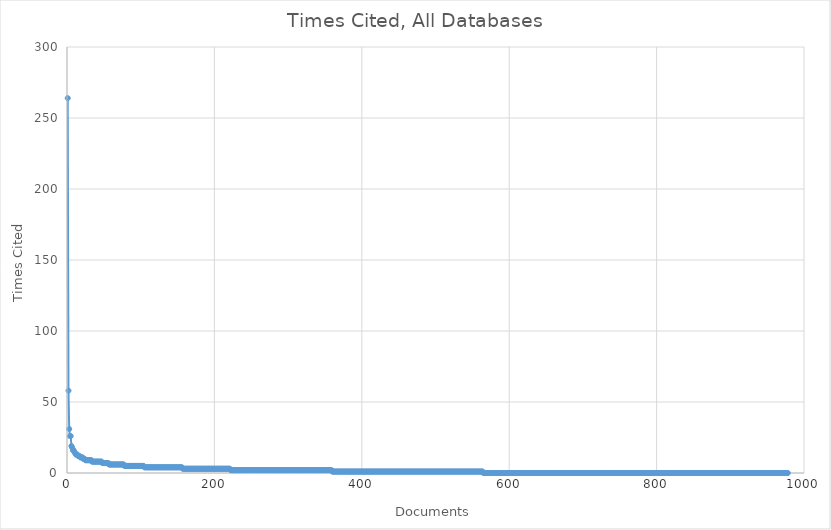
| Category | Times Cited, All Databases |
|---|---|
| 0 | 264 |
| 1 | 58 |
| 2 | 31 |
| 3 | 26 |
| 4 | 26 |
| 5 | 19 |
| 6 | 18 |
| 7 | 16 |
| 8 | 16 |
| 9 | 15 |
| 10 | 14 |
| 11 | 13 |
| 12 | 13 |
| 13 | 13 |
| 14 | 12 |
| 15 | 12 |
| 16 | 12 |
| 17 | 11 |
| 18 | 11 |
| 19 | 11 |
| 20 | 11 |
| 21 | 10 |
| 22 | 10 |
| 23 | 10 |
| 24 | 9 |
| 25 | 9 |
| 26 | 9 |
| 27 | 9 |
| 28 | 9 |
| 29 | 9 |
| 30 | 9 |
| 31 | 9 |
| 32 | 9 |
| 33 | 8 |
| 34 | 8 |
| 35 | 8 |
| 36 | 8 |
| 37 | 8 |
| 38 | 8 |
| 39 | 8 |
| 40 | 8 |
| 41 | 8 |
| 42 | 8 |
| 43 | 8 |
| 44 | 8 |
| 45 | 8 |
| 46 | 8 |
| 47 | 7 |
| 48 | 7 |
| 49 | 7 |
| 50 | 7 |
| 51 | 7 |
| 52 | 7 |
| 53 | 7 |
| 54 | 7 |
| 55 | 7 |
| 56 | 6 |
| 57 | 6 |
| 58 | 6 |
| 59 | 6 |
| 60 | 6 |
| 61 | 6 |
| 62 | 6 |
| 63 | 6 |
| 64 | 6 |
| 65 | 6 |
| 66 | 6 |
| 67 | 6 |
| 68 | 6 |
| 69 | 6 |
| 70 | 6 |
| 71 | 6 |
| 72 | 6 |
| 73 | 6 |
| 74 | 6 |
| 75 | 6 |
| 76 | 6 |
| 77 | 5 |
| 78 | 5 |
| 79 | 5 |
| 80 | 5 |
| 81 | 5 |
| 82 | 5 |
| 83 | 5 |
| 84 | 5 |
| 85 | 5 |
| 86 | 5 |
| 87 | 5 |
| 88 | 5 |
| 89 | 5 |
| 90 | 5 |
| 91 | 5 |
| 92 | 5 |
| 93 | 5 |
| 94 | 5 |
| 95 | 5 |
| 96 | 5 |
| 97 | 5 |
| 98 | 5 |
| 99 | 5 |
| 100 | 5 |
| 101 | 5 |
| 102 | 5 |
| 103 | 5 |
| 104 | 4 |
| 105 | 4 |
| 106 | 4 |
| 107 | 4 |
| 108 | 4 |
| 109 | 4 |
| 110 | 4 |
| 111 | 4 |
| 112 | 4 |
| 113 | 4 |
| 114 | 4 |
| 115 | 4 |
| 116 | 4 |
| 117 | 4 |
| 118 | 4 |
| 119 | 4 |
| 120 | 4 |
| 121 | 4 |
| 122 | 4 |
| 123 | 4 |
| 124 | 4 |
| 125 | 4 |
| 126 | 4 |
| 127 | 4 |
| 128 | 4 |
| 129 | 4 |
| 130 | 4 |
| 131 | 4 |
| 132 | 4 |
| 133 | 4 |
| 134 | 4 |
| 135 | 4 |
| 136 | 4 |
| 137 | 4 |
| 138 | 4 |
| 139 | 4 |
| 140 | 4 |
| 141 | 4 |
| 142 | 4 |
| 143 | 4 |
| 144 | 4 |
| 145 | 4 |
| 146 | 4 |
| 147 | 4 |
| 148 | 4 |
| 149 | 4 |
| 150 | 4 |
| 151 | 4 |
| 152 | 4 |
| 153 | 4 |
| 154 | 4 |
| 155 | 4 |
| 156 | 3 |
| 157 | 3 |
| 158 | 3 |
| 159 | 3 |
| 160 | 3 |
| 161 | 3 |
| 162 | 3 |
| 163 | 3 |
| 164 | 3 |
| 165 | 3 |
| 166 | 3 |
| 167 | 3 |
| 168 | 3 |
| 169 | 3 |
| 170 | 3 |
| 171 | 3 |
| 172 | 3 |
| 173 | 3 |
| 174 | 3 |
| 175 | 3 |
| 176 | 3 |
| 177 | 3 |
| 178 | 3 |
| 179 | 3 |
| 180 | 3 |
| 181 | 3 |
| 182 | 3 |
| 183 | 3 |
| 184 | 3 |
| 185 | 3 |
| 186 | 3 |
| 187 | 3 |
| 188 | 3 |
| 189 | 3 |
| 190 | 3 |
| 191 | 3 |
| 192 | 3 |
| 193 | 3 |
| 194 | 3 |
| 195 | 3 |
| 196 | 3 |
| 197 | 3 |
| 198 | 3 |
| 199 | 3 |
| 200 | 3 |
| 201 | 3 |
| 202 | 3 |
| 203 | 3 |
| 204 | 3 |
| 205 | 3 |
| 206 | 3 |
| 207 | 3 |
| 208 | 3 |
| 209 | 3 |
| 210 | 3 |
| 211 | 3 |
| 212 | 3 |
| 213 | 3 |
| 214 | 3 |
| 215 | 3 |
| 216 | 3 |
| 217 | 3 |
| 218 | 3 |
| 219 | 3 |
| 220 | 3 |
| 221 | 2 |
| 222 | 2 |
| 223 | 2 |
| 224 | 2 |
| 225 | 2 |
| 226 | 2 |
| 227 | 2 |
| 228 | 2 |
| 229 | 2 |
| 230 | 2 |
| 231 | 2 |
| 232 | 2 |
| 233 | 2 |
| 234 | 2 |
| 235 | 2 |
| 236 | 2 |
| 237 | 2 |
| 238 | 2 |
| 239 | 2 |
| 240 | 2 |
| 241 | 2 |
| 242 | 2 |
| 243 | 2 |
| 244 | 2 |
| 245 | 2 |
| 246 | 2 |
| 247 | 2 |
| 248 | 2 |
| 249 | 2 |
| 250 | 2 |
| 251 | 2 |
| 252 | 2 |
| 253 | 2 |
| 254 | 2 |
| 255 | 2 |
| 256 | 2 |
| 257 | 2 |
| 258 | 2 |
| 259 | 2 |
| 260 | 2 |
| 261 | 2 |
| 262 | 2 |
| 263 | 2 |
| 264 | 2 |
| 265 | 2 |
| 266 | 2 |
| 267 | 2 |
| 268 | 2 |
| 269 | 2 |
| 270 | 2 |
| 271 | 2 |
| 272 | 2 |
| 273 | 2 |
| 274 | 2 |
| 275 | 2 |
| 276 | 2 |
| 277 | 2 |
| 278 | 2 |
| 279 | 2 |
| 280 | 2 |
| 281 | 2 |
| 282 | 2 |
| 283 | 2 |
| 284 | 2 |
| 285 | 2 |
| 286 | 2 |
| 287 | 2 |
| 288 | 2 |
| 289 | 2 |
| 290 | 2 |
| 291 | 2 |
| 292 | 2 |
| 293 | 2 |
| 294 | 2 |
| 295 | 2 |
| 296 | 2 |
| 297 | 2 |
| 298 | 2 |
| 299 | 2 |
| 300 | 2 |
| 301 | 2 |
| 302 | 2 |
| 303 | 2 |
| 304 | 2 |
| 305 | 2 |
| 306 | 2 |
| 307 | 2 |
| 308 | 2 |
| 309 | 2 |
| 310 | 2 |
| 311 | 2 |
| 312 | 2 |
| 313 | 2 |
| 314 | 2 |
| 315 | 2 |
| 316 | 2 |
| 317 | 2 |
| 318 | 2 |
| 319 | 2 |
| 320 | 2 |
| 321 | 2 |
| 322 | 2 |
| 323 | 2 |
| 324 | 2 |
| 325 | 2 |
| 326 | 2 |
| 327 | 2 |
| 328 | 2 |
| 329 | 2 |
| 330 | 2 |
| 331 | 2 |
| 332 | 2 |
| 333 | 2 |
| 334 | 2 |
| 335 | 2 |
| 336 | 2 |
| 337 | 2 |
| 338 | 2 |
| 339 | 2 |
| 340 | 2 |
| 341 | 2 |
| 342 | 2 |
| 343 | 2 |
| 344 | 2 |
| 345 | 2 |
| 346 | 2 |
| 347 | 2 |
| 348 | 2 |
| 349 | 2 |
| 350 | 2 |
| 351 | 2 |
| 352 | 2 |
| 353 | 2 |
| 354 | 2 |
| 355 | 2 |
| 356 | 2 |
| 357 | 2 |
| 358 | 2 |
| 359 | 1 |
| 360 | 1 |
| 361 | 1 |
| 362 | 1 |
| 363 | 1 |
| 364 | 1 |
| 365 | 1 |
| 366 | 1 |
| 367 | 1 |
| 368 | 1 |
| 369 | 1 |
| 370 | 1 |
| 371 | 1 |
| 372 | 1 |
| 373 | 1 |
| 374 | 1 |
| 375 | 1 |
| 376 | 1 |
| 377 | 1 |
| 378 | 1 |
| 379 | 1 |
| 380 | 1 |
| 381 | 1 |
| 382 | 1 |
| 383 | 1 |
| 384 | 1 |
| 385 | 1 |
| 386 | 1 |
| 387 | 1 |
| 388 | 1 |
| 389 | 1 |
| 390 | 1 |
| 391 | 1 |
| 392 | 1 |
| 393 | 1 |
| 394 | 1 |
| 395 | 1 |
| 396 | 1 |
| 397 | 1 |
| 398 | 1 |
| 399 | 1 |
| 400 | 1 |
| 401 | 1 |
| 402 | 1 |
| 403 | 1 |
| 404 | 1 |
| 405 | 1 |
| 406 | 1 |
| 407 | 1 |
| 408 | 1 |
| 409 | 1 |
| 410 | 1 |
| 411 | 1 |
| 412 | 1 |
| 413 | 1 |
| 414 | 1 |
| 415 | 1 |
| 416 | 1 |
| 417 | 1 |
| 418 | 1 |
| 419 | 1 |
| 420 | 1 |
| 421 | 1 |
| 422 | 1 |
| 423 | 1 |
| 424 | 1 |
| 425 | 1 |
| 426 | 1 |
| 427 | 1 |
| 428 | 1 |
| 429 | 1 |
| 430 | 1 |
| 431 | 1 |
| 432 | 1 |
| 433 | 1 |
| 434 | 1 |
| 435 | 1 |
| 436 | 1 |
| 437 | 1 |
| 438 | 1 |
| 439 | 1 |
| 440 | 1 |
| 441 | 1 |
| 442 | 1 |
| 443 | 1 |
| 444 | 1 |
| 445 | 1 |
| 446 | 1 |
| 447 | 1 |
| 448 | 1 |
| 449 | 1 |
| 450 | 1 |
| 451 | 1 |
| 452 | 1 |
| 453 | 1 |
| 454 | 1 |
| 455 | 1 |
| 456 | 1 |
| 457 | 1 |
| 458 | 1 |
| 459 | 1 |
| 460 | 1 |
| 461 | 1 |
| 462 | 1 |
| 463 | 1 |
| 464 | 1 |
| 465 | 1 |
| 466 | 1 |
| 467 | 1 |
| 468 | 1 |
| 469 | 1 |
| 470 | 1 |
| 471 | 1 |
| 472 | 1 |
| 473 | 1 |
| 474 | 1 |
| 475 | 1 |
| 476 | 1 |
| 477 | 1 |
| 478 | 1 |
| 479 | 1 |
| 480 | 1 |
| 481 | 1 |
| 482 | 1 |
| 483 | 1 |
| 484 | 1 |
| 485 | 1 |
| 486 | 1 |
| 487 | 1 |
| 488 | 1 |
| 489 | 1 |
| 490 | 1 |
| 491 | 1 |
| 492 | 1 |
| 493 | 1 |
| 494 | 1 |
| 495 | 1 |
| 496 | 1 |
| 497 | 1 |
| 498 | 1 |
| 499 | 1 |
| 500 | 1 |
| 501 | 1 |
| 502 | 1 |
| 503 | 1 |
| 504 | 1 |
| 505 | 1 |
| 506 | 1 |
| 507 | 1 |
| 508 | 1 |
| 509 | 1 |
| 510 | 1 |
| 511 | 1 |
| 512 | 1 |
| 513 | 1 |
| 514 | 1 |
| 515 | 1 |
| 516 | 1 |
| 517 | 1 |
| 518 | 1 |
| 519 | 1 |
| 520 | 1 |
| 521 | 1 |
| 522 | 1 |
| 523 | 1 |
| 524 | 1 |
| 525 | 1 |
| 526 | 1 |
| 527 | 1 |
| 528 | 1 |
| 529 | 1 |
| 530 | 1 |
| 531 | 1 |
| 532 | 1 |
| 533 | 1 |
| 534 | 1 |
| 535 | 1 |
| 536 | 1 |
| 537 | 1 |
| 538 | 1 |
| 539 | 1 |
| 540 | 1 |
| 541 | 1 |
| 542 | 1 |
| 543 | 1 |
| 544 | 1 |
| 545 | 1 |
| 546 | 1 |
| 547 | 1 |
| 548 | 1 |
| 549 | 1 |
| 550 | 1 |
| 551 | 1 |
| 552 | 1 |
| 553 | 1 |
| 554 | 1 |
| 555 | 1 |
| 556 | 1 |
| 557 | 1 |
| 558 | 1 |
| 559 | 1 |
| 560 | 1 |
| 561 | 1 |
| 562 | 1 |
| 563 | 1 |
| 564 | 0 |
| 565 | 0 |
| 566 | 0 |
| 567 | 0 |
| 568 | 0 |
| 569 | 0 |
| 570 | 0 |
| 571 | 0 |
| 572 | 0 |
| 573 | 0 |
| 574 | 0 |
| 575 | 0 |
| 576 | 0 |
| 577 | 0 |
| 578 | 0 |
| 579 | 0 |
| 580 | 0 |
| 581 | 0 |
| 582 | 0 |
| 583 | 0 |
| 584 | 0 |
| 585 | 0 |
| 586 | 0 |
| 587 | 0 |
| 588 | 0 |
| 589 | 0 |
| 590 | 0 |
| 591 | 0 |
| 592 | 0 |
| 593 | 0 |
| 594 | 0 |
| 595 | 0 |
| 596 | 0 |
| 597 | 0 |
| 598 | 0 |
| 599 | 0 |
| 600 | 0 |
| 601 | 0 |
| 602 | 0 |
| 603 | 0 |
| 604 | 0 |
| 605 | 0 |
| 606 | 0 |
| 607 | 0 |
| 608 | 0 |
| 609 | 0 |
| 610 | 0 |
| 611 | 0 |
| 612 | 0 |
| 613 | 0 |
| 614 | 0 |
| 615 | 0 |
| 616 | 0 |
| 617 | 0 |
| 618 | 0 |
| 619 | 0 |
| 620 | 0 |
| 621 | 0 |
| 622 | 0 |
| 623 | 0 |
| 624 | 0 |
| 625 | 0 |
| 626 | 0 |
| 627 | 0 |
| 628 | 0 |
| 629 | 0 |
| 630 | 0 |
| 631 | 0 |
| 632 | 0 |
| 633 | 0 |
| 634 | 0 |
| 635 | 0 |
| 636 | 0 |
| 637 | 0 |
| 638 | 0 |
| 639 | 0 |
| 640 | 0 |
| 641 | 0 |
| 642 | 0 |
| 643 | 0 |
| 644 | 0 |
| 645 | 0 |
| 646 | 0 |
| 647 | 0 |
| 648 | 0 |
| 649 | 0 |
| 650 | 0 |
| 651 | 0 |
| 652 | 0 |
| 653 | 0 |
| 654 | 0 |
| 655 | 0 |
| 656 | 0 |
| 657 | 0 |
| 658 | 0 |
| 659 | 0 |
| 660 | 0 |
| 661 | 0 |
| 662 | 0 |
| 663 | 0 |
| 664 | 0 |
| 665 | 0 |
| 666 | 0 |
| 667 | 0 |
| 668 | 0 |
| 669 | 0 |
| 670 | 0 |
| 671 | 0 |
| 672 | 0 |
| 673 | 0 |
| 674 | 0 |
| 675 | 0 |
| 676 | 0 |
| 677 | 0 |
| 678 | 0 |
| 679 | 0 |
| 680 | 0 |
| 681 | 0 |
| 682 | 0 |
| 683 | 0 |
| 684 | 0 |
| 685 | 0 |
| 686 | 0 |
| 687 | 0 |
| 688 | 0 |
| 689 | 0 |
| 690 | 0 |
| 691 | 0 |
| 692 | 0 |
| 693 | 0 |
| 694 | 0 |
| 695 | 0 |
| 696 | 0 |
| 697 | 0 |
| 698 | 0 |
| 699 | 0 |
| 700 | 0 |
| 701 | 0 |
| 702 | 0 |
| 703 | 0 |
| 704 | 0 |
| 705 | 0 |
| 706 | 0 |
| 707 | 0 |
| 708 | 0 |
| 709 | 0 |
| 710 | 0 |
| 711 | 0 |
| 712 | 0 |
| 713 | 0 |
| 714 | 0 |
| 715 | 0 |
| 716 | 0 |
| 717 | 0 |
| 718 | 0 |
| 719 | 0 |
| 720 | 0 |
| 721 | 0 |
| 722 | 0 |
| 723 | 0 |
| 724 | 0 |
| 725 | 0 |
| 726 | 0 |
| 727 | 0 |
| 728 | 0 |
| 729 | 0 |
| 730 | 0 |
| 731 | 0 |
| 732 | 0 |
| 733 | 0 |
| 734 | 0 |
| 735 | 0 |
| 736 | 0 |
| 737 | 0 |
| 738 | 0 |
| 739 | 0 |
| 740 | 0 |
| 741 | 0 |
| 742 | 0 |
| 743 | 0 |
| 744 | 0 |
| 745 | 0 |
| 746 | 0 |
| 747 | 0 |
| 748 | 0 |
| 749 | 0 |
| 750 | 0 |
| 751 | 0 |
| 752 | 0 |
| 753 | 0 |
| 754 | 0 |
| 755 | 0 |
| 756 | 0 |
| 757 | 0 |
| 758 | 0 |
| 759 | 0 |
| 760 | 0 |
| 761 | 0 |
| 762 | 0 |
| 763 | 0 |
| 764 | 0 |
| 765 | 0 |
| 766 | 0 |
| 767 | 0 |
| 768 | 0 |
| 769 | 0 |
| 770 | 0 |
| 771 | 0 |
| 772 | 0 |
| 773 | 0 |
| 774 | 0 |
| 775 | 0 |
| 776 | 0 |
| 777 | 0 |
| 778 | 0 |
| 779 | 0 |
| 780 | 0 |
| 781 | 0 |
| 782 | 0 |
| 783 | 0 |
| 784 | 0 |
| 785 | 0 |
| 786 | 0 |
| 787 | 0 |
| 788 | 0 |
| 789 | 0 |
| 790 | 0 |
| 791 | 0 |
| 792 | 0 |
| 793 | 0 |
| 794 | 0 |
| 795 | 0 |
| 796 | 0 |
| 797 | 0 |
| 798 | 0 |
| 799 | 0 |
| 800 | 0 |
| 801 | 0 |
| 802 | 0 |
| 803 | 0 |
| 804 | 0 |
| 805 | 0 |
| 806 | 0 |
| 807 | 0 |
| 808 | 0 |
| 809 | 0 |
| 810 | 0 |
| 811 | 0 |
| 812 | 0 |
| 813 | 0 |
| 814 | 0 |
| 815 | 0 |
| 816 | 0 |
| 817 | 0 |
| 818 | 0 |
| 819 | 0 |
| 820 | 0 |
| 821 | 0 |
| 822 | 0 |
| 823 | 0 |
| 824 | 0 |
| 825 | 0 |
| 826 | 0 |
| 827 | 0 |
| 828 | 0 |
| 829 | 0 |
| 830 | 0 |
| 831 | 0 |
| 832 | 0 |
| 833 | 0 |
| 834 | 0 |
| 835 | 0 |
| 836 | 0 |
| 837 | 0 |
| 838 | 0 |
| 839 | 0 |
| 840 | 0 |
| 841 | 0 |
| 842 | 0 |
| 843 | 0 |
| 844 | 0 |
| 845 | 0 |
| 846 | 0 |
| 847 | 0 |
| 848 | 0 |
| 849 | 0 |
| 850 | 0 |
| 851 | 0 |
| 852 | 0 |
| 853 | 0 |
| 854 | 0 |
| 855 | 0 |
| 856 | 0 |
| 857 | 0 |
| 858 | 0 |
| 859 | 0 |
| 860 | 0 |
| 861 | 0 |
| 862 | 0 |
| 863 | 0 |
| 864 | 0 |
| 865 | 0 |
| 866 | 0 |
| 867 | 0 |
| 868 | 0 |
| 869 | 0 |
| 870 | 0 |
| 871 | 0 |
| 872 | 0 |
| 873 | 0 |
| 874 | 0 |
| 875 | 0 |
| 876 | 0 |
| 877 | 0 |
| 878 | 0 |
| 879 | 0 |
| 880 | 0 |
| 881 | 0 |
| 882 | 0 |
| 883 | 0 |
| 884 | 0 |
| 885 | 0 |
| 886 | 0 |
| 887 | 0 |
| 888 | 0 |
| 889 | 0 |
| 890 | 0 |
| 891 | 0 |
| 892 | 0 |
| 893 | 0 |
| 894 | 0 |
| 895 | 0 |
| 896 | 0 |
| 897 | 0 |
| 898 | 0 |
| 899 | 0 |
| 900 | 0 |
| 901 | 0 |
| 902 | 0 |
| 903 | 0 |
| 904 | 0 |
| 905 | 0 |
| 906 | 0 |
| 907 | 0 |
| 908 | 0 |
| 909 | 0 |
| 910 | 0 |
| 911 | 0 |
| 912 | 0 |
| 913 | 0 |
| 914 | 0 |
| 915 | 0 |
| 916 | 0 |
| 917 | 0 |
| 918 | 0 |
| 919 | 0 |
| 920 | 0 |
| 921 | 0 |
| 922 | 0 |
| 923 | 0 |
| 924 | 0 |
| 925 | 0 |
| 926 | 0 |
| 927 | 0 |
| 928 | 0 |
| 929 | 0 |
| 930 | 0 |
| 931 | 0 |
| 932 | 0 |
| 933 | 0 |
| 934 | 0 |
| 935 | 0 |
| 936 | 0 |
| 937 | 0 |
| 938 | 0 |
| 939 | 0 |
| 940 | 0 |
| 941 | 0 |
| 942 | 0 |
| 943 | 0 |
| 944 | 0 |
| 945 | 0 |
| 946 | 0 |
| 947 | 0 |
| 948 | 0 |
| 949 | 0 |
| 950 | 0 |
| 951 | 0 |
| 952 | 0 |
| 953 | 0 |
| 954 | 0 |
| 955 | 0 |
| 956 | 0 |
| 957 | 0 |
| 958 | 0 |
| 959 | 0 |
| 960 | 0 |
| 961 | 0 |
| 962 | 0 |
| 963 | 0 |
| 964 | 0 |
| 965 | 0 |
| 966 | 0 |
| 967 | 0 |
| 968 | 0 |
| 969 | 0 |
| 970 | 0 |
| 971 | 0 |
| 972 | 0 |
| 973 | 0 |
| 974 | 0 |
| 975 | 0 |
| 976 | 0 |
| 977 | 0 |